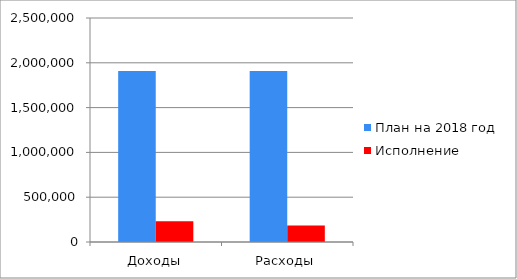
| Category | План на 2018 год | Исполнение |
|---|---|---|
| Доходы | 1909690 | 232578 |
| Расходы | 1909690 | 184211 |